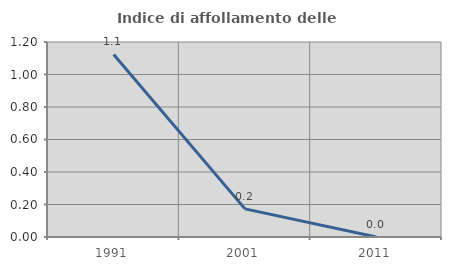
| Category | Indice di affollamento delle abitazioni  |
|---|---|
| 1991.0 | 1.124 |
| 2001.0 | 0.173 |
| 2011.0 | 0 |